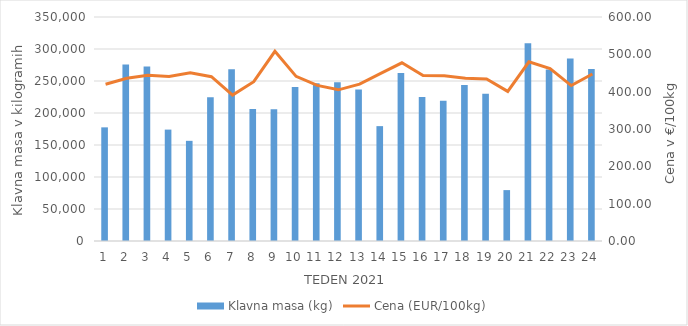
| Category | Klavna masa (kg) |
|---|---|
| 1.0 | 177573 |
| 2.0 | 275951 |
| 3.0 | 272797 |
| 4.0 | 174056 |
| 5.0 | 156508 |
| 6.0 | 224595 |
| 7.0 | 268436 |
| 8.0 | 206193 |
| 9.0 | 205669 |
| 10.0 | 240592 |
| 11.0 | 246325 |
| 12.0 | 248020 |
| 13.0 | 236703 |
| 14.0 | 179478 |
| 15.0 | 262544 |
| 16.0 | 225033 |
| 17.0 | 218950 |
| 18.0 | 243711 |
| 19.0 | 229955 |
| 20.0 | 79521 |
| 21.0 | 309134 |
| 22.0 | 268074 |
| 23.0 | 285151 |
| 24.0 | 268579 |